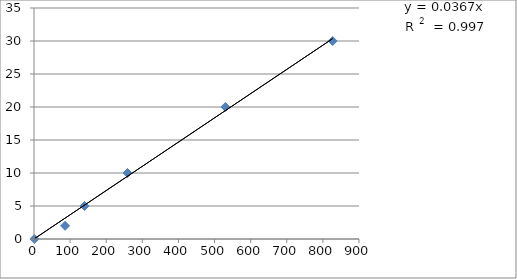
| Category | Series 0 |
|---|---|
| 1.0 | 0 |
| 86.0 | 2 |
| 140.0 | 5 |
| 259.0 | 10 |
| 530.0 | 20 |
| 827.0 | 30 |